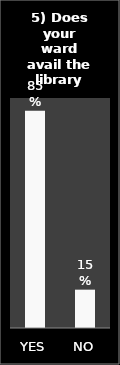
| Category | Series 0 |
|---|---|
| YES | 0.85 |
| NO | 0.15 |